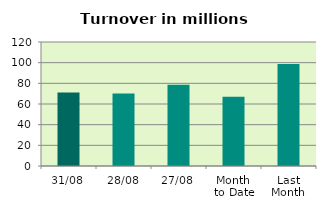
| Category | Series 0 |
|---|---|
| 31/08 | 71.071 |
| 28/08 | 70.042 |
| 27/08 | 78.603 |
| Month 
to Date | 66.948 |
| Last
Month | 98.668 |